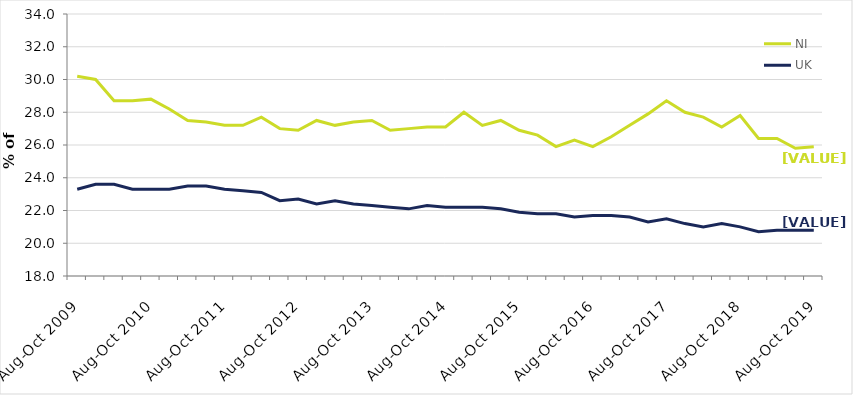
| Category | NI | UK |
|---|---|---|
| Aug-Oct 2009 | 30.2 | 23.3 |
| Nov-Jan 2010 | 30 | 23.6 |
| Feb-Apr 2010 | 28.7 | 23.6 |
| May-Jul 2010 | 28.7 | 23.3 |
| Aug-Oct 2010 | 28.8 | 23.3 |
| Nov-Jan 2011 | 28.2 | 23.3 |
| Feb-Apr 2011 | 27.5 | 23.5 |
| May-Jul 2011 | 27.4 | 23.5 |
| Aug-Oct 2011 | 27.2 | 23.3 |
| Nov-Jan 2012 | 27.2 | 23.2 |
| Feb-Apr 2012 | 27.7 | 23.1 |
| May-Jul 2012 | 27 | 22.6 |
| Aug-Oct 2012 | 26.9 | 22.7 |
| Nov-Jan 2013 | 27.5 | 22.4 |
| Feb-Apr 2013 | 27.2 | 22.6 |
| May-Jul 2013 | 27.4 | 22.4 |
| Aug-Oct 2013 | 27.5 | 22.3 |
| Nov-Jan 2014 | 26.9 | 22.2 |
| Feb-Apr 2014 | 27 | 22.1 |
| May-Jul 2014 | 27.1 | 22.3 |
| Aug-Oct 2014 | 27.1 | 22.2 |
| Nov-Jan 2015 | 28 | 22.2 |
| Feb-Apr 2015 | 27.2 | 22.2 |
| May-Jul 2015 | 27.5 | 22.1 |
| Aug-Oct 2015 | 26.9 | 21.9 |
| Nov-Jan 2016 | 26.6 | 21.8 |
| Feb-Apr 2016 | 25.9 | 21.8 |
| May-Jul 2016 | 26.3 | 21.6 |
| Aug-Oct 2016 | 25.9 | 21.7 |
| Nov-Jan 2017 | 26.5 | 21.7 |
| Feb-Apr 2017 | 27.2 | 21.6 |
| May-Jul 2017 | 27.9 | 21.3 |
| Aug-Oct 2017 | 28.7 | 21.5 |
| Nov-Jan 2018 | 28 | 21.2 |
| Feb-Apr 2018 | 27.7 | 21 |
| May-Jul 2018 | 27.1 | 21.2 |
| Aug-Oct 2018 | 27.8 | 21 |
| Nov-Jan 2019 | 26.4 | 20.7 |
| Feb-Apr 2019 | 26.4 | 20.8 |
| May-Jul 2019 | 25.8 | 20.8 |
| Aug-Oct 2019 | 25.9 | 20.8 |